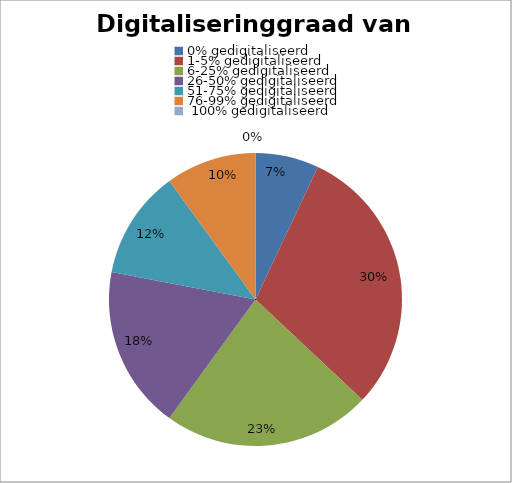
| Category | Series 0 |
|---|---|
| 0% gedigitaliseerd | 0.07 |
| 1-5% gedigitaliseerd | 0.3 |
| 6-25% gedigitaliseerd | 0.23 |
| 26-50% gedigitaliseerd | 0.18 |
| 51-75% gedigitaliseerd | 0.12 |
| 76-99% gedigitaliseerd | 0.1 |
|  100% gedigitaliseerd | 0 |